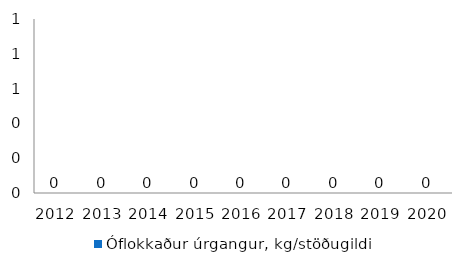
| Category | Óflokkaður úrgangur, kg/stöðugildi |
|---|---|
| 2012.0 | 0 |
| 2013.0 | 0 |
| 2014.0 | 0 |
| 2015.0 | 0 |
| 2016.0 | 0 |
| 2017.0 | 0 |
| 2018.0 | 0 |
| 2019.0 | 0 |
| 2020.0 | 0 |